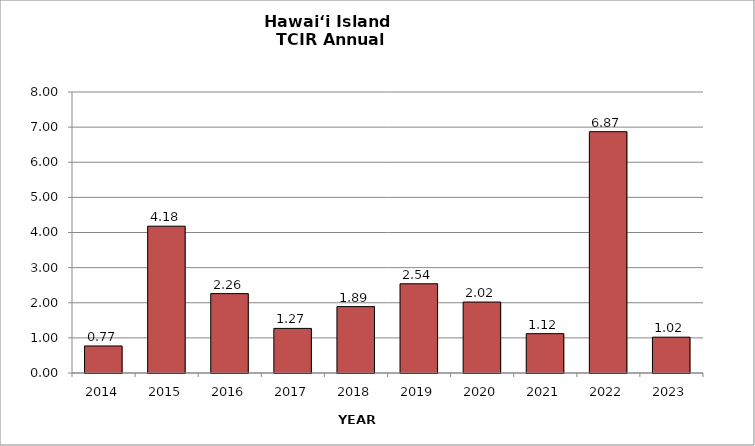
| Category | Hawai‘i Island |
|---|---|
| 2014.0 | 0.77 |
| 2015.0 | 4.18 |
| 2016.0 | 2.26 |
| 2017.0 | 1.27 |
| 2018.0 | 1.89 |
| 2019.0 | 2.54 |
| 2020.0 | 2.02 |
| 2021.0 | 1.12 |
| 2022.0 | 6.87 |
| 2023.0 | 1.02 |